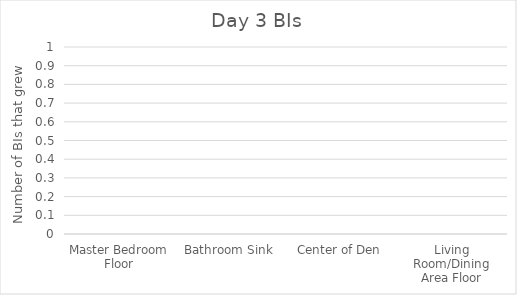
| Category | Series 0 |
|---|---|
| Master Bedroom Floor | 0 |
| Bathroom Sink | 0 |
| Center of Den | 0 |
| Living Room/Dining Area Floor | 0 |